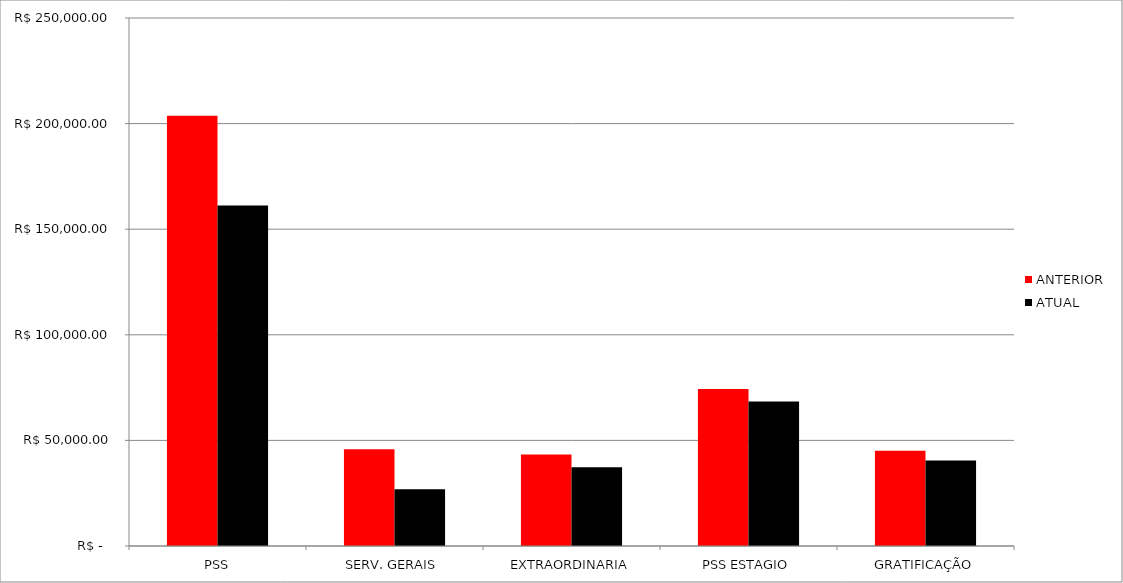
| Category | ANTERIOR | ATUAL  |
|---|---|---|
| PSS | 203695.52 | 161181.9 |
| SERV. GERAIS | 45762 | 26885.01 |
| EXTRAORDINARIA | 43285.23 | 37339.74 |
| PSS ESTAGIO | 74293.6 | 68396.73 |
| GRATIFICAÇÃO | 45129.27 | 40529.27 |